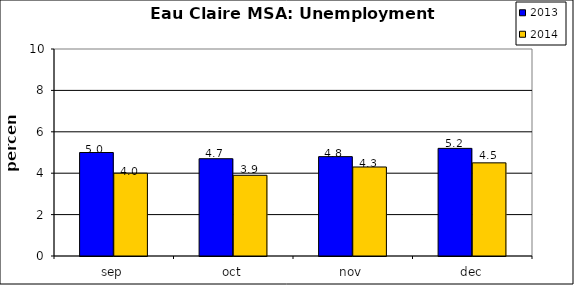
| Category | 2013 | 2014 |
|---|---|---|
| sep | 5 | 4 |
| oct | 4.7 | 3.9 |
| nov | 4.8 | 4.3 |
| dec | 5.2 | 4.5 |